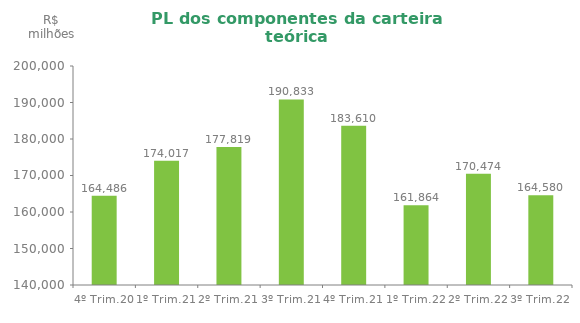
| Category | Series 0 |
|---|---|
| 4º Trim.20 | 164486.25 |
| 1º Trim.21 | 174016.57 |
| 2º Trim.21 | 177819.2 |
| 3º Trim.21 | 190833.2 |
| 4º Trim.21 | 183610.486 |
| 1º Trim.22 | 161864.31 |
| 2º Trim.22 | 170474.192 |
| 3º Trim.22 | 164580 |